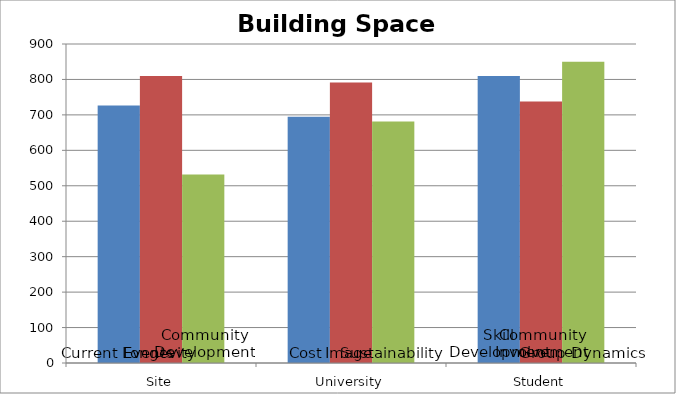
| Category | Alignment1 | Alignment2 | Alignment3 |
|---|---|---|---|
| 0 | 726.25 | 810 | 531.5 |
| 1 | 695 | 791.25 | 681.25 |
| 2 | 810 | 737.5 | 850 |